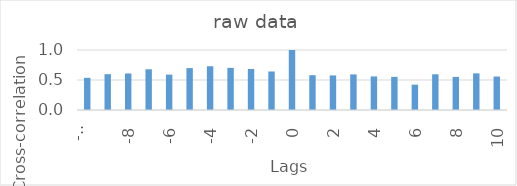
| Category | raw data |
|---|---|
| -10.0 | 0.536 |
| -9.0 | 0.597 |
| -8.0 | 0.609 |
| -7.0 | 0.679 |
| -6.0 | 0.59 |
| -5.0 | 0.699 |
| -4.0 | 0.729 |
| -3.0 | 0.702 |
| -2.0 | 0.683 |
| -1.0 | 0.642 |
| 0.0 | 1 |
| 1.0 | 0.58 |
| 2.0 | 0.577 |
| 3.0 | 0.593 |
| 4.0 | 0.56 |
| 5.0 | 0.552 |
| 6.0 | 0.422 |
| 7.0 | 0.595 |
| 8.0 | 0.551 |
| 9.0 | 0.61 |
| 10.0 | 0.558 |